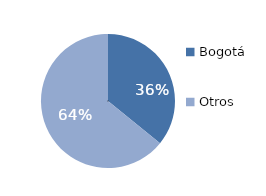
| Category | Series 0 |
|---|---|
| Bogotá | 35.845 |
| Otros | 64.155 |